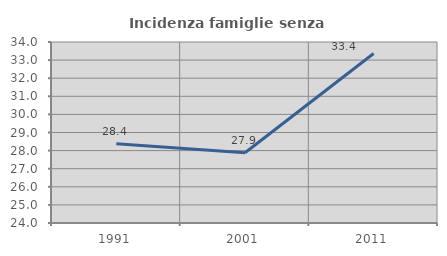
| Category | Incidenza famiglie senza nuclei |
|---|---|
| 1991.0 | 28.378 |
| 2001.0 | 27.884 |
| 2011.0 | 33.364 |